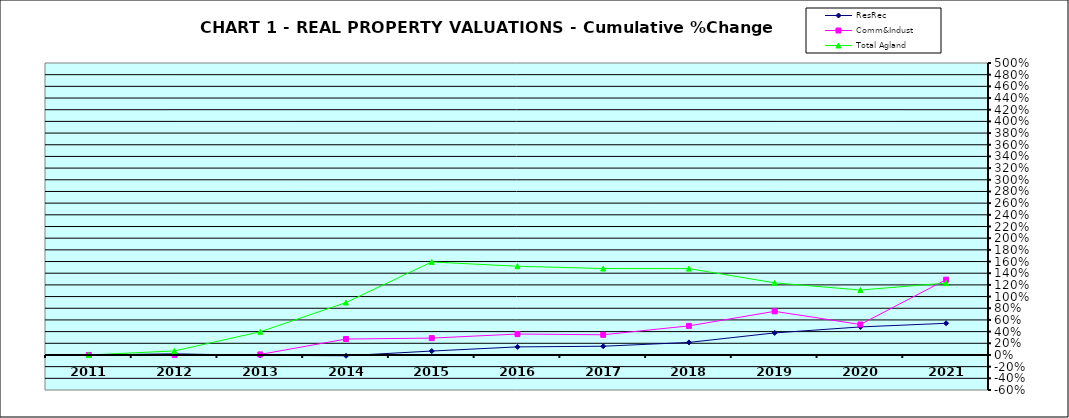
| Category | ResRec | Comm&Indust | Total Agland |
|---|---|---|---|
| 2011.0 | 0 | 0 | 0 |
| 2012.0 | 0.019 | 0.002 | 0.069 |
| 2013.0 | -0.007 | 0.009 | 0.397 |
| 2014.0 | -0.013 | 0.273 | 0.897 |
| 2015.0 | 0.067 | 0.289 | 1.593 |
| 2016.0 | 0.138 | 0.358 | 1.52 |
| 2017.0 | 0.149 | 0.346 | 1.48 |
| 2018.0 | 0.215 | 0.498 | 1.479 |
| 2019.0 | 0.378 | 0.747 | 1.235 |
| 2020.0 | 0.48 | 0.522 | 1.112 |
| 2021.0 | 0.542 | 1.289 | 1.231 |